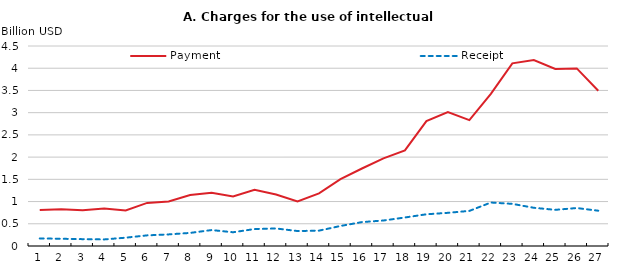
| Category | Payment | Receipt |
|---|---|---|
| 1.0 | 0.808 | 0.17 |